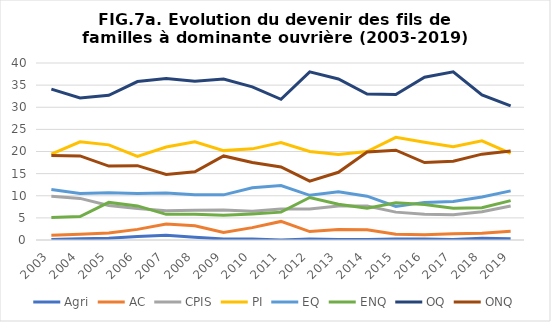
| Category | Agri | AC | CPIS | PI | EQ | ENQ | OQ | ONQ |
|---|---|---|---|---|---|---|---|---|
| 2003.0 | 0.1 | 1.1 | 9.9 | 19.4 | 11.4 | 5.1 | 34.1 | 19.1 |
| 2004.0 | 0.3 | 1.3 | 9.4 | 22.2 | 10.5 | 5.3 | 32.1 | 19 |
| 2005.0 | 0.4 | 1.6 | 7.8 | 21.5 | 10.7 | 8.5 | 32.7 | 16.7 |
| 2006.0 | 0.8 | 2.4 | 7.1 | 18.9 | 10.5 | 7.7 | 35.8 | 16.8 |
| 2007.0 | 1.1 | 3.6 | 6.6 | 21 | 10.6 | 5.8 | 36.5 | 14.8 |
| 2008.0 | 0.6 | 3.2 | 6.7 | 22.2 | 10.2 | 5.8 | 35.9 | 15.4 |
| 2009.0 | 0.2 | 1.7 | 6.8 | 20.2 | 10.2 | 5.6 | 36.4 | 19 |
| 2010.0 | 0.2 | 2.8 | 6.5 | 20.6 | 11.8 | 5.9 | 34.6 | 17.5 |
| 2011.0 | 0 | 4.2 | 7 | 22 | 12.3 | 6.3 | 31.8 | 16.5 |
| 2012.0 | 0.2 | 1.9 | 7 | 20 | 10.1 | 9.6 | 38 | 13.3 |
| 2013.0 | 0.1 | 2.4 | 7.7 | 19.3 | 10.9 | 8.1 | 36.4 | 15.3 |
| 2014.0 | 0.1 | 2.3 | 7.7 | 20 | 9.9 | 7.2 | 33 | 19.9 |
| 2015.0 | 0.2 | 1.3 | 6.3 | 23.2 | 7.6 | 8.4 | 32.9 | 20.3 |
| 2016.0 | 0.2 | 1.2 | 5.8 | 22.1 | 8.5 | 8 | 36.8 | 17.5 |
| 2017.0 | 0.1 | 1.4 | 5.7 | 21.1 | 8.7 | 7.2 | 38 | 17.8 |
| 2018.0 | 0.4 | 1.5 | 6.4 | 22.4 | 9.7 | 7.3 | 32.8 | 19.4 |
| 2019.0 | 0.3 | 2 | 7.7 | 19.6 | 11.1 | 8.9 | 30.3 | 20.1 |